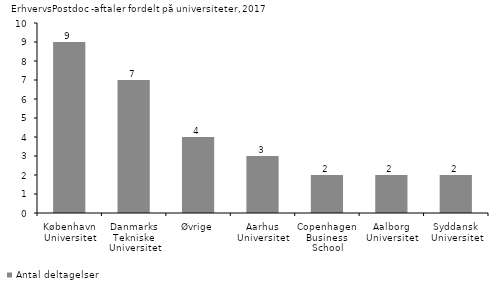
| Category | Antal deltagelser |
|---|---|
| København Universitet | 9 |
| Danmarks Tekniske Universitet | 7 |
| Øvrige | 4 |
| Aarhus Universitet | 3 |
| Copenhagen Business School | 2 |
| Aalborg Universitet | 2 |
| Syddansk Universitet | 2 |